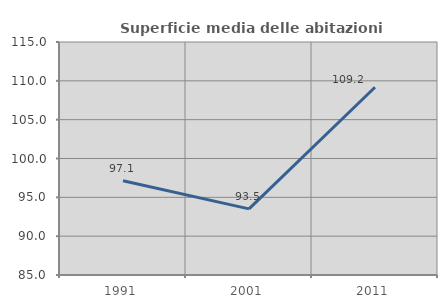
| Category | Superficie media delle abitazioni occupate |
|---|---|
| 1991.0 | 97.126 |
| 2001.0 | 93.518 |
| 2011.0 | 109.172 |